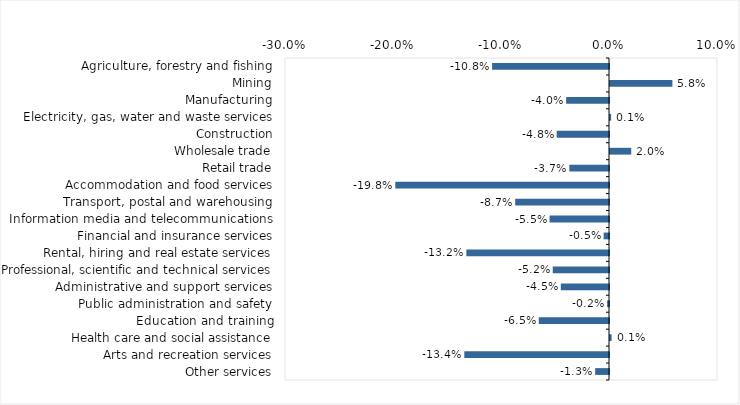
| Category | This week |
|---|---|
| Agriculture, forestry and fishing | -0.108 |
| Mining | 0.058 |
| Manufacturing | -0.04 |
| Electricity, gas, water and waste services | 0.001 |
| Construction | -0.048 |
| Wholesale trade | 0.02 |
| Retail trade | -0.037 |
| Accommodation and food services | -0.198 |
| Transport, postal and warehousing | -0.087 |
| Information media and telecommunications | -0.055 |
| Financial and insurance services | -0.005 |
| Rental, hiring and real estate services | -0.132 |
| Professional, scientific and technical services | -0.052 |
| Administrative and support services | -0.045 |
| Public administration and safety | -0.002 |
| Education and training | -0.065 |
| Health care and social assistance | 0.001 |
| Arts and recreation services | -0.134 |
| Other services | -0.013 |